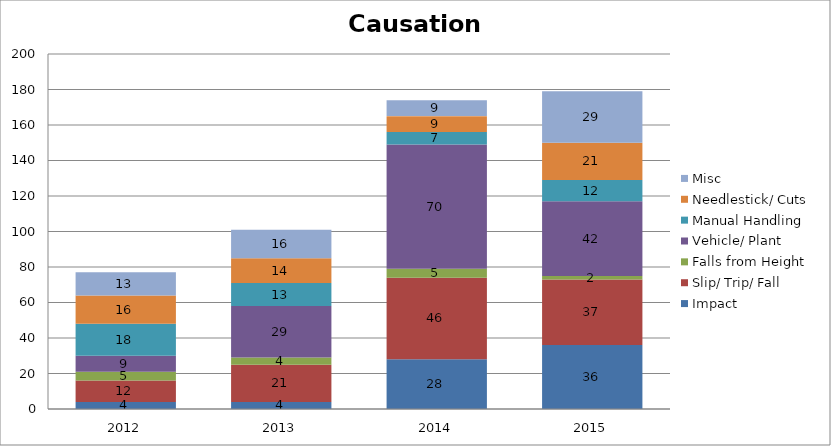
| Category | Impact | Slip/ Trip/ Fall | Falls from Height | Vehicle/ Plant | Manual Handling | Needlestick/ Cuts  | Misc |
|---|---|---|---|---|---|---|---|
| 2012.0 | 4 | 12 | 5 | 9 | 18 | 16 | 13 |
| 2013.0 | 4 | 21 | 4 | 29 | 13 | 14 | 16 |
| 2014.0 | 28 | 46 | 5 | 70 | 7 | 9 | 9 |
| 2015.0 | 36 | 37 | 2 | 42 | 12 | 21 | 29 |